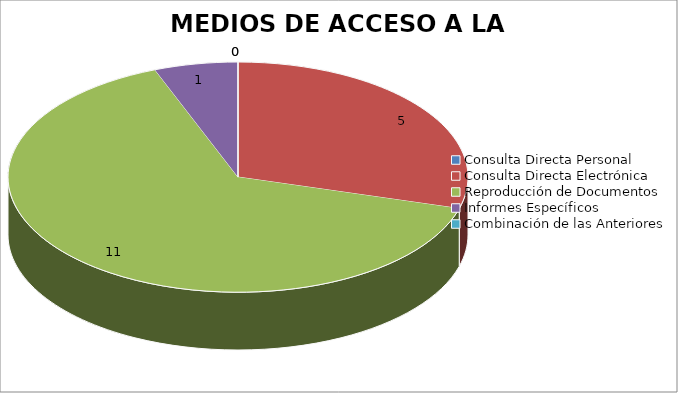
| Category | MEDIOS DE ACCESO A LA INFORMACIÓN |
|---|---|
| 0 | 0 |
| 1 | 5 |
| 2 | 11 |
| 3 | 1 |
| 4 | 0 |